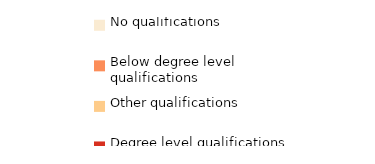
| Category | No qualifications | Below degree level qualifications | Other qualifications | Degree level qualifications |   |
|---|---|---|---|---|---|
| Gypsy/Irish Traveller | 61.453 | 24.881 | 4.473 | 9.193 |  |
| White Irish | 6.659 | 31.436 | 6.802 | 55.103 |  |
| Bangladeshi | 31.209 | 34.104 | 15.169 | 19.518 |  |
| Pakistani | 26.122 | 31.878 | 14.647 | 27.354 |  |
| White British | 9.998 | 52.687 | 2.157 | 35.158 |  |
| White-Caribbean | 16.537 | 51.505 | 4.393 | 27.565 |  |
| Other | 15.728 | 25.396 | 19.02 | 39.857 |  |
| Black Caribbean | 7.497 | 49.052 | 4.783 | 38.668 |  |
| Other Black | 15.384 | 43.101 | 8.831 | 32.683 |  |
| Chinese | 11.688 | 16.047 | 13.283 | 58.982 |  |
| Other Asian | 13.678 | 23.831 | 20.356 | 42.136 |  |
| Indian | 8.108 | 26.105 | 11.526 | 54.261 |  |
| Arab | 15.493 | 19.463 | 22.551 | 42.493 |  |
| Other Mixed | 10.479 | 31.988 | 10.259 | 47.274 |  |
| White-African | 10.962 | 38.361 | 12.02 | 38.657 |  |
| Mixed White & Asian | 10.556 | 33.162 | 6.764 | 49.518 |  |
| Other White | 8.096 | 17.956 | 27.727 | 46.221 |  |
| Black African | 11.278 | 32.63 | 11.068 | 45.025 |  |